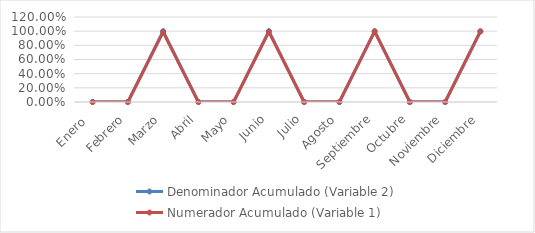
| Category | Denominador Acumulado (Variable 2) | Numerador Acumulado (Variable 1) |
|---|---|---|
| Enero  | 0 | 0 |
| Febrero | 0 | 0 |
| Marzo | 1 | 0.987 |
| Abril | 0 | 0 |
| Mayo | 0 | 0 |
| Junio | 1 | 0.991 |
| Julio | 0 | 0 |
| Agosto | 0 | 0 |
| Septiembre | 1 | 0.994 |
| Octubre | 0 | 0 |
| Noviembre | 0 | 0 |
| Diciembre | 1 | 0.994 |